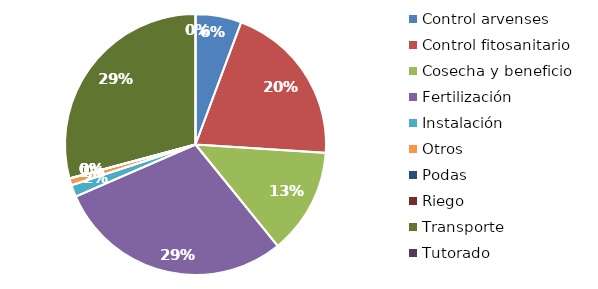
| Category | Valor |
|---|---|
| Control arvenses | 2447529.333 |
| Control fitosanitario | 8740811 |
| Cosecha y beneficio | 5654411.906 |
| Fertilización | 12601571.667 |
| Instalación | 635171.192 |
| Otros | 365560 |
| Podas | 0 |
| Riego | 0 |
| Transporte | 12557618.333 |
| Tutorado | 0 |